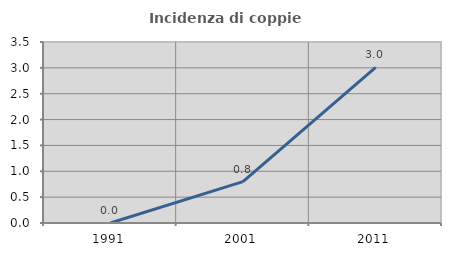
| Category | Incidenza di coppie miste |
|---|---|
| 1991.0 | 0 |
| 2001.0 | 0.8 |
| 2011.0 | 3.008 |